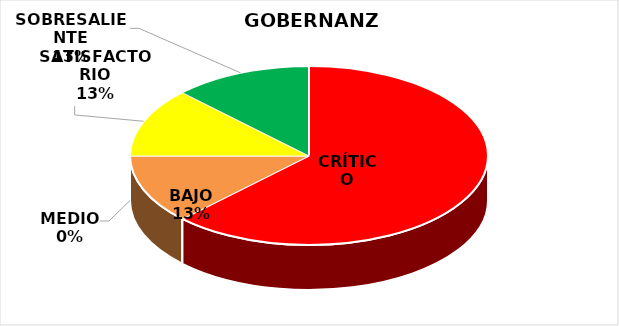
| Category | Series 1 | Series 0 |
|---|---|---|
| CRÍTICO | 5 | 8 |
| BAJO | 1 | 1 |
| MEDIO | 0 | 0 |
| SATISFACTORIO | 1 | 0 |
| SOBRESALIENTE | 1 | 6 |